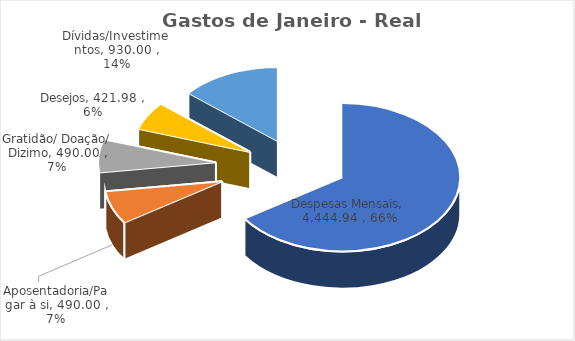
| Category | Gastos de Janeiro - Real Acumulado |
|---|---|
| Despesas Mensais | 4444.94 |
| Aposentadoria/Pagar à si | 490 |
| Gratidão/ Doação/ Dizimo | 490 |
| Desejos | 421.98 |
| Dívidas/Investimentos | 930 |